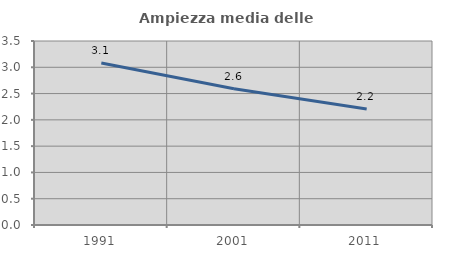
| Category | Ampiezza media delle famiglie |
|---|---|
| 1991.0 | 3.081 |
| 2001.0 | 2.592 |
| 2011.0 | 2.208 |